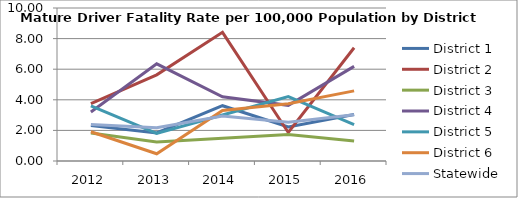
| Category | District 1 | District 2 | District 3 | District 4 | District 5 | District 6 | Statewide |
|---|---|---|---|---|---|---|---|
| 2012.0 | 2.321 | 3.756 | 1.83 | 3.206 | 3.598 | 1.909 | 2.381 |
| 2013.0 | 1.839 | 5.629 | 1.246 | 6.354 | 1.806 | 0.475 | 2.171 |
| 2014.0 | 3.613 | 8.409 | 1.492 | 4.2 | 3.008 | 3.298 | 2.937 |
| 2015.0 | 2.222 | 1.862 | 1.734 | 3.638 | 4.206 | 3.736 | 2.538 |
| 2016.0 | 3.043 | 7.403 | 1.307 | 6.187 | 2.384 | 4.583 | 3.03 |